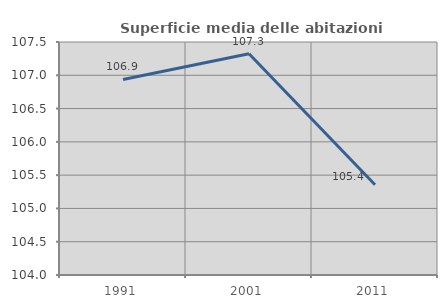
| Category | Superficie media delle abitazioni occupate |
|---|---|
| 1991.0 | 106.938 |
| 2001.0 | 107.323 |
| 2011.0 | 105.355 |